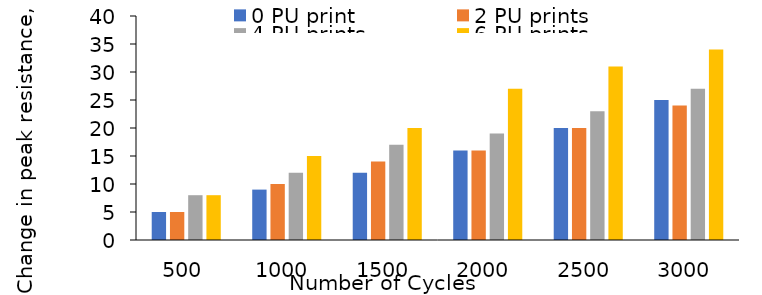
| Category | 0 PU print | 2 PU prints | 4 PU prints | 6 PU prints |
|---|---|---|---|---|
| 500.0 | 5 | 5 | 8 | 8 |
| 1000.0 | 9 | 10 | 12 | 15 |
| 1500.0 | 12 | 14 | 17 | 20 |
| 2000.0 | 16 | 16 | 19 | 27 |
| 2500.0 | 20 | 20 | 23 | 31 |
| 3000.0 | 25 | 24 | 27 | 34 |